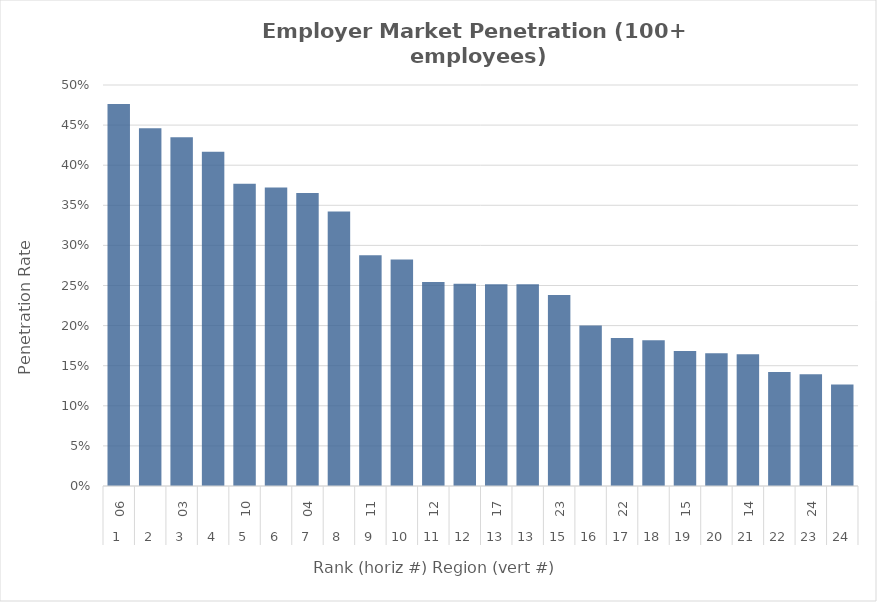
| Category | Rate |
|---|---|
| 0 | 0.476 |
| 1 | 0.446 |
| 2 | 0.435 |
| 3 | 0.417 |
| 4 | 0.377 |
| 5 | 0.372 |
| 6 | 0.365 |
| 7 | 0.342 |
| 8 | 0.288 |
| 9 | 0.282 |
| 10 | 0.254 |
| 11 | 0.252 |
| 12 | 0.251 |
| 13 | 0.251 |
| 14 | 0.238 |
| 15 | 0.2 |
| 16 | 0.185 |
| 17 | 0.182 |
| 18 | 0.168 |
| 19 | 0.165 |
| 20 | 0.164 |
| 21 | 0.142 |
| 22 | 0.139 |
| 23 | 0.126 |